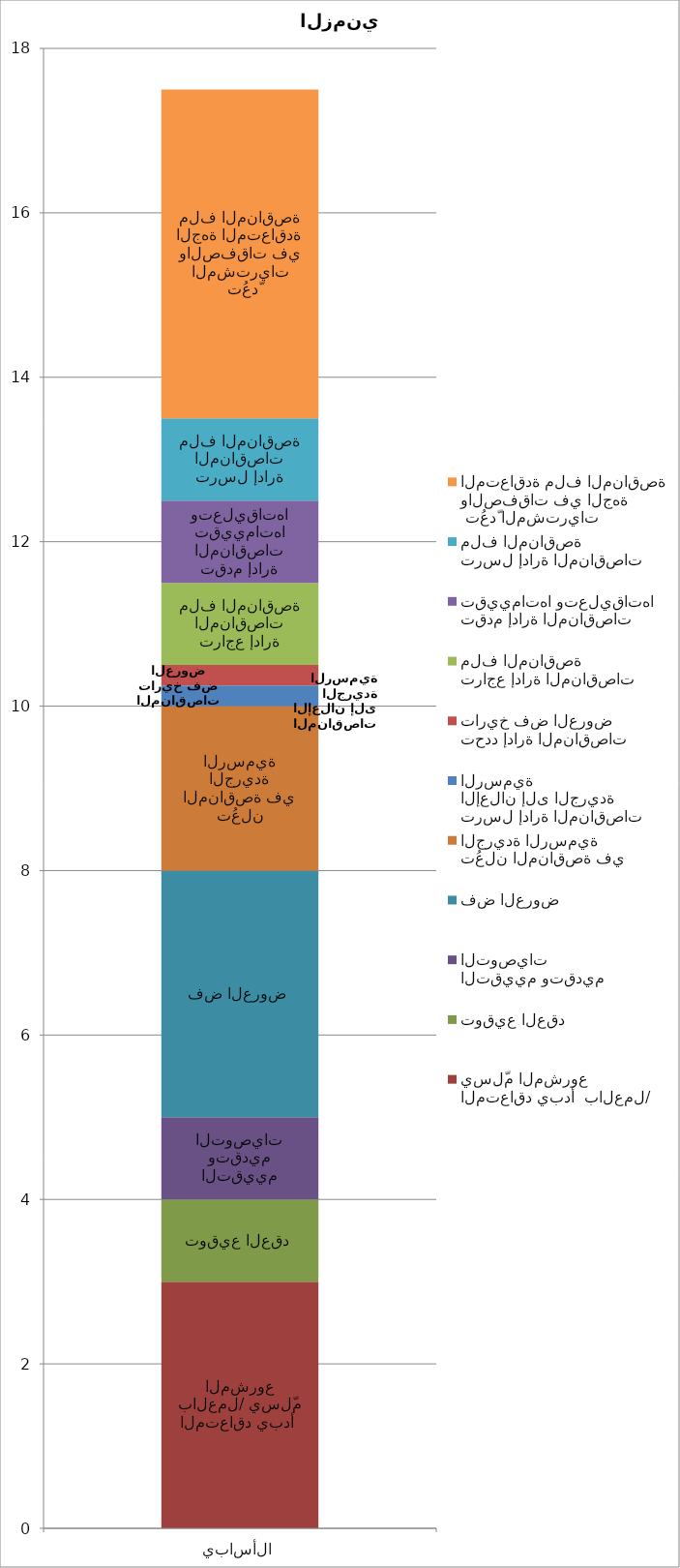
| Category | المتعاقد يبدأ  بالعمل/ يسلّم المشروع | توقيع العقد | التقييم وتقديم التوصيات | فض العروض | تُعلن المناقصة في الجريدة الرسمية | ترسل إدارة المناقصات الإعلان إلى الجريدة الرسمية | تحدد إدارة المناقصات تاريخ فض العروض | تراجع إدارة المناقصات ملف المناقصة | تقدم إدارة المناقصات تقييماتها وتعليقاتها | ترسل إدارة المناقصات ملف المناقصة |  تُعدّ المشتريات والصفقات في الجهة المتعاقدة ملف المناقصة |
|---|---|---|---|---|---|---|---|---|---|---|---|
| الأسابيع | 3 | 1 | 1 | 3 | 2 | 0.25 | 0.25 | 1 | 1 | 1 | 4 |